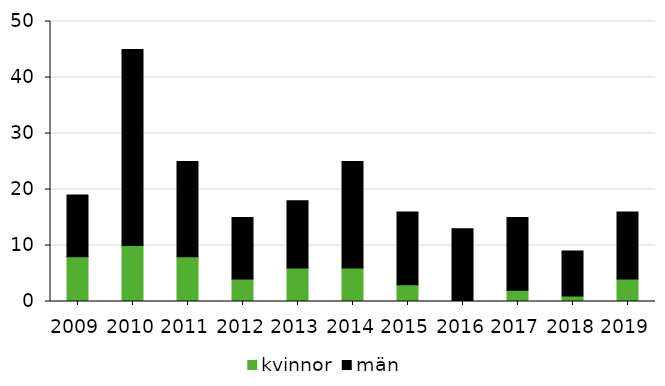
| Category | kvinnor | män |
|---|---|---|
| 2009 | 8 | 11 |
| 2010 | 10 | 35 |
| 2011 | 8 | 17 |
| 2012 | 4 | 11 |
| 2013 | 6 | 12 |
| 2014 | 6 | 19 |
| 2015 | 3 | 13 |
| 2016 | 0 | 13 |
| 2017 | 2 | 13 |
| 2018 | 1 | 8 |
| 2019 | 4 | 12 |